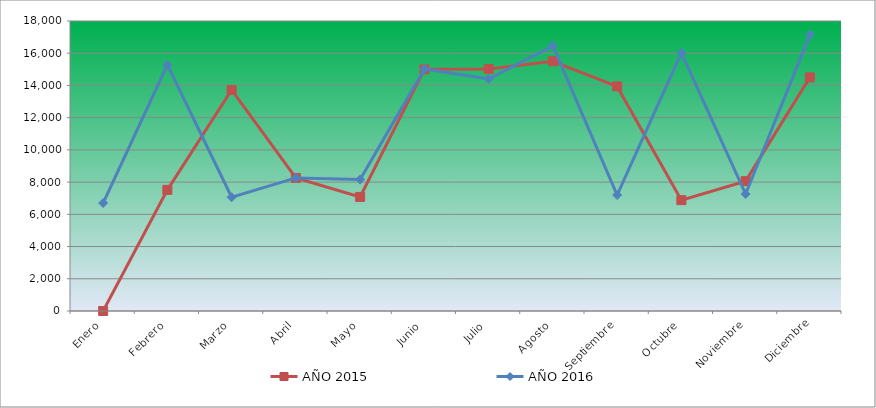
| Category | AÑO 2015 | AÑO 2016 |
|---|---|---|
| Enero | 0 | 6700 |
| Febrero | 7520 | 15280 |
| Marzo | 13720 | 7060 |
| Abril | 8260 | 8260 |
| Mayo | 7080 | 8160 |
| Junio | 15000 | 15020 |
| Julio | 15020 | 14400 |
| Agosto | 15500 | 16460 |
| Septiembre | 13940 | 7200 |
| Octubre | 6880 | 16020 |
| Noviembre | 8060 | 7260 |
| Diciembre | 14500 | 17140 |